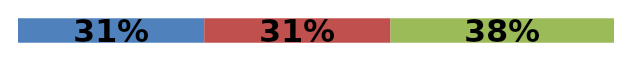
| Category | Series 0 | Series 1 | Series 2 |
|---|---|---|---|
| 0 | 0.312 | 0.312 | 0.375 |